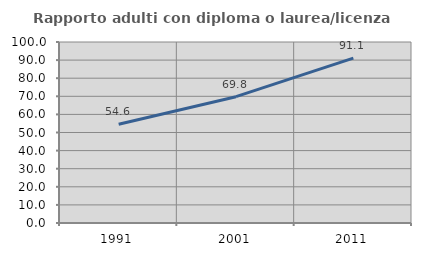
| Category | Rapporto adulti con diploma o laurea/licenza media  |
|---|---|
| 1991.0 | 54.554 |
| 2001.0 | 69.789 |
| 2011.0 | 91.055 |